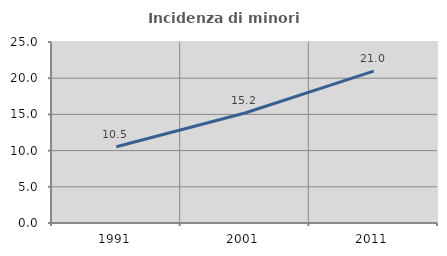
| Category | Incidenza di minori stranieri |
|---|---|
| 1991.0 | 10.526 |
| 2001.0 | 15.2 |
| 2011.0 | 20.985 |